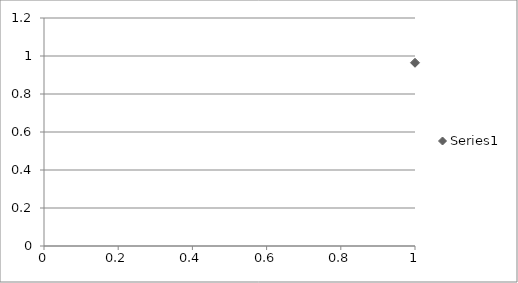
| Category | Series 0 |
|---|---|
| 0 | 0.964 |
| 1 | 0.108 |
| 2 | 0.126 |
| 3 | 0.35 |
| 4 | 0.215 |
| 5 | 0.462 |
| 6 | 0.497 |
| 7 | 0.971 |
| 8 | 0.632 |
| 9 | 0.214 |
| 10 | 0.374 |
| 11 | 0.754 |
| 12 | 0.197 |
| 13 | 0.841 |
| 14 | 0.139 |
| 15 | 0.509 |
| 16 | 0.901 |
| 17 | 0.523 |
| 18 | 0.504 |
| 19 | 0.668 |
| 20 | 0.908 |
| 21 | 0.339 |
| 22 | 0.966 |
| 23 | 0.082 |
| 24 | 0.018 |
| 25 | 0.483 |
| 26 | 0.585 |
| 27 | 0.712 |
| 28 | 0.056 |
| 29 | 0.386 |
| 30 | 0.513 |
| 31 | 0.481 |
| 32 | 0.746 |
| 33 | 0.662 |
| 34 | 0.565 |
| 35 | 0.668 |
| 36 | 0.032 |
| 37 | 0.702 |
| 38 | 0.179 |
| 39 | 0.099 |
| 40 | 0.786 |
| 41 | 0.452 |
| 42 | 0.988 |
| 43 | 0.299 |
| 44 | 0.237 |
| 45 | 0.693 |
| 46 | 0.95 |
| 47 | 0.008 |
| 48 | 0.587 |
| 49 | 0.468 |
| 50 | 0.325 |
| 51 | 0.137 |
| 52 | 0.388 |
| 53 | 0.441 |
| 54 | 0.627 |
| 55 | 0.654 |
| 56 | 0.939 |
| 57 | 0.945 |
| 58 | 0.495 |
| 59 | 0.209 |
| 60 | 0.556 |
| 61 | 0.982 |
| 62 | 0.539 |
| 63 | 0.829 |
| 64 | 0.675 |
| 65 | 0.525 |
| 66 | 0.032 |
| 67 | 0.222 |
| 68 | 0.001 |
| 69 | 0.052 |
| 70 | 0.384 |
| 71 | 0.608 |
| 72 | 0.71 |
| 73 | 0.337 |
| 74 | 0.727 |
| 75 | 0.946 |
| 76 | 0.787 |
| 77 | 0.031 |
| 78 | 0.849 |
| 79 | 0.59 |
| 80 | 0.38 |
| 81 | 0.543 |
| 82 | 0.306 |
| 83 | 0.293 |
| 84 | 0.263 |
| 85 | 0.341 |
| 86 | 0.958 |
| 87 | 0.161 |
| 88 | 0.018 |
| 89 | 0.322 |
| 90 | 0.839 |
| 91 | 0.08 |
| 92 | 0.7 |
| 93 | 0.92 |
| 94 | 0.735 |
| 95 | 0.815 |
| 96 | 0.788 |
| 97 | 0.943 |
| 98 | 0.381 |
| 99 | 0.764 |
| 100 | 0.171 |
| 101 | 0.246 |
| 102 | 0.247 |
| 103 | 0.099 |
| 104 | 0.295 |
| 105 | 0.354 |
| 106 | 0.834 |
| 107 | 0.998 |
| 108 | 0.956 |
| 109 | 0.673 |
| 110 | 0.473 |
| 111 | 0.728 |
| 112 | 0.249 |
| 113 | 0.071 |
| 114 | 0.127 |
| 115 | 0.199 |
| 116 | 0.549 |
| 117 | 0.355 |
| 118 | 0.424 |
| 119 | 0.923 |
| 120 | 0.4 |
| 121 | 0.304 |
| 122 | 0.174 |
| 123 | 0.596 |
| 124 | 0.894 |
| 125 | 0.275 |
| 126 | 0.883 |
| 127 | 0.578 |
| 128 | 0.822 |
| 129 | 0.9 |
| 130 | 0.183 |
| 131 | 0.86 |
| 132 | 0.188 |
| 133 | 0.451 |
| 134 | 0.958 |
| 135 | 0.277 |
| 136 | 0.422 |
| 137 | 0.264 |
| 138 | 0.416 |
| 139 | 0.442 |
| 140 | 0.82 |
| 141 | 0.099 |
| 142 | 0.677 |
| 143 | 0.889 |
| 144 | 0.832 |
| 145 | 0.068 |
| 146 | 0.707 |
| 147 | 0.9 |
| 148 | 0.861 |
| 149 | 0.378 |
| 150 | 0.135 |
| 151 | 0.01 |
| 152 | 0.655 |
| 153 | 0.379 |
| 154 | 0.309 |
| 155 | 0.417 |
| 156 | 0.222 |
| 157 | 0.639 |
| 158 | 0.36 |
| 159 | 0.918 |
| 160 | 0.589 |
| 161 | 0.856 |
| 162 | 0.449 |
| 163 | 0.572 |
| 164 | 0.22 |
| 165 | 0.833 |
| 166 | 0.286 |
| 167 | 0.704 |
| 168 | 0.881 |
| 169 | 0.288 |
| 170 | 0.693 |
| 171 | 0.069 |
| 172 | 0.238 |
| 173 | 0.693 |
| 174 | 0.838 |
| 175 | 0.29 |
| 176 | 0.423 |
| 177 | 0.927 |
| 178 | 0.977 |
| 179 | 0.618 |
| 180 | 0.931 |
| 181 | 0.859 |
| 182 | 0.653 |
| 183 | 0.353 |
| 184 | 0.578 |
| 185 | 0.79 |
| 186 | 0.38 |
| 187 | 0.473 |
| 188 | 0.525 |
| 189 | 0.731 |
| 190 | 0.204 |
| 191 | 0.638 |
| 192 | 0.318 |
| 193 | 0.777 |
| 194 | 0.235 |
| 195 | 0.755 |
| 196 | 0.326 |
| 197 | 0.416 |
| 198 | 0.091 |
| 199 | 0.897 |
| 200 | 0.491 |
| 201 | 0.196 |
| 202 | 0.493 |
| 203 | 0.071 |
| 204 | 0.766 |
| 205 | 0.931 |
| 206 | 0.158 |
| 207 | 0.71 |
| 208 | 0.509 |
| 209 | 0.424 |
| 210 | 0.221 |
| 211 | 0.516 |
| 212 | 0.542 |
| 213 | 0.944 |
| 214 | 0.137 |
| 215 | 0.964 |
| 216 | 0.585 |
| 217 | 0.384 |
| 218 | 0.198 |
| 219 | 0.447 |
| 220 | 0.789 |
| 221 | 0.864 |
| 222 | 0.142 |
| 223 | 0.188 |
| 224 | 0.358 |
| 225 | 0.207 |
| 226 | 0.124 |
| 227 | 0.571 |
| 228 | 0.538 |
| 229 | 0.928 |
| 230 | 0.747 |
| 231 | 0.669 |
| 232 | 0.53 |
| 233 | 0.06 |
| 234 | 0.235 |
| 235 | 0.617 |
| 236 | 0.808 |
| 237 | 0.393 |
| 238 | 0.296 |
| 239 | 0.854 |
| 240 | 0.611 |
| 241 | 0.027 |
| 242 | 0.132 |
| 243 | 0.101 |
| 244 | 0.156 |
| 245 | 0.203 |
| 246 | 0.772 |
| 247 | 0.312 |
| 248 | 0.908 |
| 249 | 0.479 |
| 250 | 0.969 |
| 251 | 0.513 |
| 252 | 0.789 |
| 253 | 0.669 |
| 254 | 0.72 |
| 255 | 0.734 |
| 256 | 0.635 |
| 257 | 0.592 |
| 258 | 0.559 |
| 259 | 0.118 |
| 260 | 0.391 |
| 261 | 0.925 |
| 262 | 0.631 |
| 263 | 0.116 |
| 264 | 0.899 |
| 265 | 0.778 |
| 266 | 0.705 |
| 267 | 0.021 |
| 268 | 0.129 |
| 269 | 0.419 |
| 270 | 0.078 |
| 271 | 0.962 |
| 272 | 0.52 |
| 273 | 0.427 |
| 274 | 0.562 |
| 275 | 0.83 |
| 276 | 0.15 |
| 277 | 0.986 |
| 278 | 0.834 |
| 279 | 0.577 |
| 280 | 0.838 |
| 281 | 0.952 |
| 282 | 0.195 |
| 283 | 0.678 |
| 284 | 0.069 |
| 285 | 0.437 |
| 286 | 0.51 |
| 287 | 0.619 |
| 288 | 0.355 |
| 289 | 0.609 |
| 290 | 0.803 |
| 291 | 0.848 |
| 292 | 0.223 |
| 293 | 0.09 |
| 294 | 0.792 |
| 295 | 0.14 |
| 296 | 0.827 |
| 297 | 0.739 |
| 298 | 0.945 |
| 299 | 0.255 |
| 300 | 0.177 |
| 301 | 0.805 |
| 302 | 0.149 |
| 303 | 0.217 |
| 304 | 0.996 |
| 305 | 0.294 |
| 306 | 0.937 |
| 307 | 0.143 |
| 308 | 0.079 |
| 309 | 0.51 |
| 310 | 0.998 |
| 311 | 0.346 |
| 312 | 0.151 |
| 313 | 0.264 |
| 314 | 0.705 |
| 315 | 0.948 |
| 316 | 0.612 |
| 317 | 0.174 |
| 318 | 0.706 |
| 319 | 0.508 |
| 320 | 0.683 |
| 321 | 0.378 |
| 322 | 0.136 |
| 323 | 0.746 |
| 324 | 0.302 |
| 325 | 0.001 |
| 326 | 0.28 |
| 327 | 0.511 |
| 328 | 0.257 |
| 329 | 0.935 |
| 330 | 0.316 |
| 331 | 0.546 |
| 332 | 0.54 |
| 333 | 0.772 |
| 334 | 0.903 |
| 335 | 0.274 |
| 336 | 0.133 |
| 337 | 0.33 |
| 338 | 0.805 |
| 339 | 0.252 |
| 340 | 0.896 |
| 341 | 0.592 |
| 342 | 0.953 |
| 343 | 0.169 |
| 344 | 0.16 |
| 345 | 0.943 |
| 346 | 0.975 |
| 347 | 0.007 |
| 348 | 0.137 |
| 349 | 0.097 |
| 350 | 0.997 |
| 351 | 0.064 |
| 352 | 0.503 |
| 353 | 0.753 |
| 354 | 0.468 |
| 355 | 0.139 |
| 356 | 0.368 |
| 357 | 0.758 |
| 358 | 0.322 |
| 359 | 0.009 |
| 360 | 0.069 |
| 361 | 0.073 |
| 362 | 0.434 |
| 363 | 0.27 |
| 364 | 0.479 |
| 365 | 0.123 |
| 366 | 0.759 |
| 367 | 0.908 |
| 368 | 0.957 |
| 369 | 0.966 |
| 370 | 0.25 |
| 371 | 0.694 |
| 372 | 0.19 |
| 373 | 0.069 |
| 374 | 0.523 |
| 375 | 0.099 |
| 376 | 0.088 |
| 377 | 0.803 |
| 378 | 0.156 |
| 379 | 0.287 |
| 380 | 0.023 |
| 381 | 0.539 |
| 382 | 0.343 |
| 383 | 0.031 |
| 384 | 0.327 |
| 385 | 0.721 |
| 386 | 0.229 |
| 387 | 0.802 |
| 388 | 0.263 |
| 389 | 0.633 |
| 390 | 0.975 |
| 391 | 0.433 |
| 392 | 0.56 |
| 393 | 0.476 |
| 394 | 0.291 |
| 395 | 0.664 |
| 396 | 0.18 |
| 397 | 0.074 |
| 398 | 0.228 |
| 399 | 0.232 |
| 400 | 0.961 |
| 401 | 0.874 |
| 402 | 0.842 |
| 403 | 0.67 |
| 404 | 0.082 |
| 405 | 0.504 |
| 406 | 0.884 |
| 407 | 0.982 |
| 408 | 0.898 |
| 409 | 0.27 |
| 410 | 0.176 |
| 411 | 0.032 |
| 412 | 0.826 |
| 413 | 0.868 |
| 414 | 0.684 |
| 415 | 0.997 |
| 416 | 0.25 |
| 417 | 0.098 |
| 418 | 0.134 |
| 419 | 0.274 |
| 420 | 0.742 |
| 421 | 0.318 |
| 422 | 0.148 |
| 423 | 0.145 |
| 424 | 0.17 |
| 425 | 0.761 |
| 426 | 0.429 |
| 427 | 0.775 |
| 428 | 0.807 |
| 429 | 0.719 |
| 430 | 0.208 |
| 431 | 0.013 |
| 432 | 0.638 |
| 433 | 0.777 |
| 434 | 0.497 |
| 435 | 0.93 |
| 436 | 0.095 |
| 437 | 0.908 |
| 438 | 0.046 |
| 439 | 0.608 |
| 440 | 0.49 |
| 441 | 0.945 |
| 442 | 0.288 |
| 443 | 0.67 |
| 444 | 0.196 |
| 445 | 0.67 |
| 446 | 0.149 |
| 447 | 0.712 |
| 448 | 0.869 |
| 449 | 0.462 |
| 450 | 0.667 |
| 451 | 0.717 |
| 452 | 0.698 |
| 453 | 0.735 |
| 454 | 0.452 |
| 455 | 0.47 |
| 456 | 0.645 |
| 457 | 0.719 |
| 458 | 0.643 |
| 459 | 0.142 |
| 460 | 0.333 |
| 461 | 0.94 |
| 462 | 0.834 |
| 463 | 0.037 |
| 464 | 0.533 |
| 465 | 0.255 |
| 466 | 0.657 |
| 467 | 0.657 |
| 468 | 0.145 |
| 469 | 0.063 |
| 470 | 0.638 |
| 471 | 0.014 |
| 472 | 0.81 |
| 473 | 0.292 |
| 474 | 0.981 |
| 475 | 0.446 |
| 476 | 0.362 |
| 477 | 0.365 |
| 478 | 0.016 |
| 479 | 0.644 |
| 480 | 0.488 |
| 481 | 0.633 |
| 482 | 0.684 |
| 483 | 0.26 |
| 484 | 0.393 |
| 485 | 0.617 |
| 486 | 0.62 |
| 487 | 0.68 |
| 488 | 0.756 |
| 489 | 0.75 |
| 490 | 0.751 |
| 491 | 0.112 |
| 492 | 0.406 |
| 493 | 0.329 |
| 494 | 0.692 |
| 495 | 0.961 |
| 496 | 0.295 |
| 497 | 0.873 |
| 498 | 0.569 |
| 499 | 0.717 |
| 500 | 0.634 |
| 501 | 0.651 |
| 502 | 0.629 |
| 503 | 0.044 |
| 504 | 0.094 |
| 505 | 0.325 |
| 506 | 0.456 |
| 507 | 0.761 |
| 508 | 0.535 |
| 509 | 0.869 |
| 510 | 0.597 |
| 511 | 0.179 |
| 512 | 0.327 |
| 513 | 0.462 |
| 514 | 0.674 |
| 515 | 0.108 |
| 516 | 0.303 |
| 517 | 0.549 |
| 518 | 0.377 |
| 519 | 0.062 |
| 520 | 0.569 |
| 521 | 0.917 |
| 522 | 0.287 |
| 523 | 0.549 |
| 524 | 0.749 |
| 525 | 0.321 |
| 526 | 0.264 |
| 527 | 0.616 |
| 528 | 0.223 |
| 529 | 0.747 |
| 530 | 0.626 |
| 531 | 0.034 |
| 532 | 0.677 |
| 533 | 0.995 |
| 534 | 0.091 |
| 535 | 0.989 |
| 536 | 0.425 |
| 537 | 0.019 |
| 538 | 0.695 |
| 539 | 0.819 |
| 540 | 0.685 |
| 541 | 0.6 |
| 542 | 0.042 |
| 543 | 0.323 |
| 544 | 0.715 |
| 545 | 0.305 |
| 546 | 0.378 |
| 547 | 0.44 |
| 548 | 0.977 |
| 549 | 0.262 |
| 550 | 0.524 |
| 551 | 0.612 |
| 552 | 0.597 |
| 553 | 0.084 |
| 554 | 0.344 |
| 555 | 0.65 |
| 556 | 0.943 |
| 557 | 0.572 |
| 558 | 0.74 |
| 559 | 0.05 |
| 560 | 0.522 |
| 561 | 0.703 |
| 562 | 0.044 |
| 563 | 0.996 |
| 564 | 0.059 |
| 565 | 0.175 |
| 566 | 0.315 |
| 567 | 0.478 |
| 568 | 0.926 |
| 569 | 0.679 |
| 570 | 0.517 |
| 571 | 0.166 |
| 572 | 0.561 |
| 573 | 0.141 |
| 574 | 0.512 |
| 575 | 0.63 |
| 576 | 0.1 |
| 577 | 0.003 |
| 578 | 0.472 |
| 579 | 0.648 |
| 580 | 0.433 |
| 581 | 0.177 |
| 582 | 0.398 |
| 583 | 0.425 |
| 584 | 0.039 |
| 585 | 0.395 |
| 586 | 0.371 |
| 587 | 0.426 |
| 588 | 0.341 |
| 589 | 0.55 |
| 590 | 0.372 |
| 591 | 0.748 |
| 592 | 0.378 |
| 593 | 0.736 |
| 594 | 0.815 |
| 595 | 0.882 |
| 596 | 0.847 |
| 597 | 0.642 |
| 598 | 0.01 |
| 599 | 0.999 |
| 600 | 0.054 |
| 601 | 0.444 |
| 602 | 0.536 |
| 603 | 0.543 |
| 604 | 0.639 |
| 605 | 0.215 |
| 606 | 0 |
| 607 | 0.181 |
| 608 | 0.832 |
| 609 | 0.92 |
| 610 | 0.916 |
| 611 | 0.663 |
| 612 | 0.23 |
| 613 | 0.644 |
| 614 | 0.649 |
| 615 | 0.812 |
| 616 | 0.232 |
| 617 | 0.265 |
| 618 | 0.466 |
| 619 | 0.894 |
| 620 | 0.263 |
| 621 | 0.312 |
| 622 | 0.058 |
| 623 | 0.269 |
| 624 | 0.098 |
| 625 | 0.702 |
| 626 | 0.251 |
| 627 | 0.351 |
| 628 | 0.401 |
| 629 | 0.507 |
| 630 | 0.767 |
| 631 | 0.139 |
| 632 | 0.826 |
| 633 | 0.578 |
| 634 | 0.737 |
| 635 | 0.182 |
| 636 | 0.061 |
| 637 | 0.248 |
| 638 | 0.43 |
| 639 | 0.763 |
| 640 | 0.741 |
| 641 | 0.864 |
| 642 | 0.477 |
| 643 | 0.923 |
| 644 | 0.673 |
| 645 | 0.339 |
| 646 | 0.066 |
| 647 | 0.914 |
| 648 | 0.548 |
| 649 | 0.961 |
| 650 | 0.08 |
| 651 | 0.629 |
| 652 | 0.002 |
| 653 | 0.371 |
| 654 | 0.532 |
| 655 | 0.302 |
| 656 | 0.998 |
| 657 | 0.866 |
| 658 | 0.214 |
| 659 | 0.437 |
| 660 | 0.147 |
| 661 | 0.693 |
| 662 | 0.492 |
| 663 | 0.591 |
| 664 | 0.203 |
| 665 | 0.486 |
| 666 | 0.52 |
| 667 | 0.144 |
| 668 | 0.19 |
| 669 | 0.125 |
| 670 | 0.772 |
| 671 | 0.334 |
| 672 | 0.955 |
| 673 | 0.047 |
| 674 | 0.053 |
| 675 | 0.295 |
| 676 | 0.717 |
| 677 | 0.515 |
| 678 | 0.43 |
| 679 | 0.535 |
| 680 | 0.433 |
| 681 | 0.407 |
| 682 | 0.133 |
| 683 | 0.055 |
| 684 | 0.61 |
| 685 | 0.963 |
| 686 | 0.781 |
| 687 | 0.53 |
| 688 | 0.278 |
| 689 | 0.179 |
| 690 | 0.769 |
| 691 | 0.395 |
| 692 | 0.932 |
| 693 | 0.219 |
| 694 | 0.65 |
| 695 | 0.299 |
| 696 | 0.035 |
| 697 | 0.556 |
| 698 | 0.392 |
| 699 | 0.597 |
| 700 | 0.857 |
| 701 | 0.919 |
| 702 | 0.012 |
| 703 | 0.964 |
| 704 | 0.138 |
| 705 | 0.689 |
| 706 | 0.487 |
| 707 | 0.265 |
| 708 | 0.824 |
| 709 | 0.32 |
| 710 | 0.243 |
| 711 | 0.037 |
| 712 | 0.363 |
| 713 | 0.459 |
| 714 | 0.866 |
| 715 | 0.242 |
| 716 | 0.825 |
| 717 | 0.296 |
| 718 | 0.198 |
| 719 | 0.892 |
| 720 | 0.78 |
| 721 | 0.885 |
| 722 | 0.381 |
| 723 | 0.508 |
| 724 | 0.177 |
| 725 | 0.159 |
| 726 | 0.923 |
| 727 | 0.932 |
| 728 | 0.071 |
| 729 | 0.453 |
| 730 | 0.291 |
| 731 | 0.813 |
| 732 | 0.569 |
| 733 | 0.776 |
| 734 | 0.652 |
| 735 | 0.992 |
| 736 | 0.2 |
| 737 | 0.406 |
| 738 | 0.648 |
| 739 | 0.806 |
| 740 | 0.288 |
| 741 | 0.594 |
| 742 | 0.661 |
| 743 | 0.37 |
| 744 | 0.83 |
| 745 | 0.707 |
| 746 | 0.388 |
| 747 | 0.488 |
| 748 | 0.551 |
| 749 | 0.145 |
| 750 | 0.781 |
| 751 | 0.868 |
| 752 | 0.559 |
| 753 | 0.145 |
| 754 | 0.371 |
| 755 | 0.418 |
| 756 | 0.666 |
| 757 | 0.886 |
| 758 | 0.036 |
| 759 | 0.1 |
| 760 | 0.606 |
| 761 | 0.345 |
| 762 | 0.816 |
| 763 | 0.15 |
| 764 | 0.4 |
| 765 | 0.984 |
| 766 | 0.532 |
| 767 | 0.731 |
| 768 | 0.146 |
| 769 | 0.207 |
| 770 | 0.098 |
| 771 | 0.535 |
| 772 | 0.994 |
| 773 | 0.852 |
| 774 | 0.622 |
| 775 | 0.233 |
| 776 | 0.694 |
| 777 | 0.882 |
| 778 | 0.879 |
| 779 | 0.605 |
| 780 | 0.181 |
| 781 | 0.524 |
| 782 | 0.56 |
| 783 | 0.955 |
| 784 | 0.97 |
| 785 | 0.45 |
| 786 | 0.53 |
| 787 | 0.156 |
| 788 | 0.066 |
| 789 | 0.735 |
| 790 | 0.511 |
| 791 | 0.361 |
| 792 | 0.084 |
| 793 | 0.027 |
| 794 | 0.106 |
| 795 | 0.865 |
| 796 | 0.396 |
| 797 | 0.473 |
| 798 | 0.678 |
| 799 | 0.292 |
| 800 | 0.021 |
| 801 | 0.133 |
| 802 | 0.087 |
| 803 | 0.255 |
| 804 | 0.378 |
| 805 | 0.065 |
| 806 | 0.889 |
| 807 | 0.751 |
| 808 | 0.383 |
| 809 | 0.208 |
| 810 | 0.059 |
| 811 | 0.143 |
| 812 | 0.662 |
| 813 | 0.092 |
| 814 | 0.271 |
| 815 | 0.303 |
| 816 | 0.401 |
| 817 | 0.819 |
| 818 | 0.483 |
| 819 | 0.884 |
| 820 | 0.716 |
| 821 | 0.308 |
| 822 | 0.697 |
| 823 | 0.252 |
| 824 | 0.453 |
| 825 | 0.867 |
| 826 | 0.094 |
| 827 | 0.48 |
| 828 | 0.545 |
| 829 | 0.076 |
| 830 | 0.401 |
| 831 | 0.127 |
| 832 | 0.916 |
| 833 | 0.658 |
| 834 | 0.896 |
| 835 | 0.291 |
| 836 | 0.8 |
| 837 | 0.621 |
| 838 | 0.855 |
| 839 | 0.701 |
| 840 | 0.751 |
| 841 | 0.434 |
| 842 | 0.31 |
| 843 | 0.831 |
| 844 | 0.513 |
| 845 | 0.194 |
| 846 | 0.357 |
| 847 | 0.903 |
| 848 | 0.988 |
| 849 | 0.314 |
| 850 | 0.633 |
| 851 | 0.556 |
| 852 | 0.732 |
| 853 | 0.531 |
| 854 | 0.85 |
| 855 | 0.837 |
| 856 | 0.534 |
| 857 | 0.506 |
| 858 | 0.016 |
| 859 | 0.628 |
| 860 | 0.221 |
| 861 | 0.388 |
| 862 | 0.931 |
| 863 | 0.823 |
| 864 | 0.21 |
| 865 | 0.166 |
| 866 | 0.44 |
| 867 | 0.643 |
| 868 | 0.2 |
| 869 | 0.178 |
| 870 | 0.942 |
| 871 | 0.495 |
| 872 | 0.275 |
| 873 | 0.52 |
| 874 | 0.372 |
| 875 | 0.275 |
| 876 | 0.161 |
| 877 | 0.44 |
| 878 | 0.844 |
| 879 | 0.783 |
| 880 | 0.345 |
| 881 | 0.24 |
| 882 | 0.912 |
| 883 | 0.558 |
| 884 | 0.197 |
| 885 | 0.002 |
| 886 | 0.723 |
| 887 | 0.708 |
| 888 | 0.551 |
| 889 | 0.309 |
| 890 | 0.095 |
| 891 | 0.061 |
| 892 | 0.992 |
| 893 | 0.128 |
| 894 | 0.154 |
| 895 | 0.623 |
| 896 | 0.806 |
| 897 | 0.234 |
| 898 | 0.125 |
| 899 | 0.88 |
| 900 | 0.26 |
| 901 | 0.694 |
| 902 | 0.722 |
| 903 | 0.107 |
| 904 | 0.606 |
| 905 | 0.052 |
| 906 | 0.74 |
| 907 | 0.875 |
| 908 | 0.538 |
| 909 | 0.14 |
| 910 | 0.657 |
| 911 | 0.361 |
| 912 | 0.909 |
| 913 | 0.253 |
| 914 | 0.437 |
| 915 | 0.74 |
| 916 | 0.766 |
| 917 | 0.098 |
| 918 | 0.204 |
| 919 | 0.479 |
| 920 | 0.854 |
| 921 | 0.649 |
| 922 | 0 |
| 923 | 0.934 |
| 924 | 0.995 |
| 925 | 0.726 |
| 926 | 0.445 |
| 927 | 0.728 |
| 928 | 0.044 |
| 929 | 0.654 |
| 930 | 0.787 |
| 931 | 0.604 |
| 932 | 0.702 |
| 933 | 0.692 |
| 934 | 0.073 |
| 935 | 0.251 |
| 936 | 0.866 |
| 937 | 0.205 |
| 938 | 0.687 |
| 939 | 0.494 |
| 940 | 0.066 |
| 941 | 0.449 |
| 942 | 0.14 |
| 943 | 0.989 |
| 944 | 0.833 |
| 945 | 0.346 |
| 946 | 0.427 |
| 947 | 0.56 |
| 948 | 0.749 |
| 949 | 0.561 |
| 950 | 0.422 |
| 951 | 0.248 |
| 952 | 0.667 |
| 953 | 0.646 |
| 954 | 0.335 |
| 955 | 0.082 |
| 956 | 0.357 |
| 957 | 0.686 |
| 958 | 0.392 |
| 959 | 0.623 |
| 960 | 0.147 |
| 961 | 0.99 |
| 962 | 0.504 |
| 963 | 0.36 |
| 964 | 0.716 |
| 965 | 0.927 |
| 966 | 0.815 |
| 967 | 0.432 |
| 968 | 0.593 |
| 969 | 0.716 |
| 970 | 0.674 |
| 971 | 0.329 |
| 972 | 0.545 |
| 973 | 0.553 |
| 974 | 0.096 |
| 975 | 0.945 |
| 976 | 0.781 |
| 977 | 0.64 |
| 978 | 0.701 |
| 979 | 0.494 |
| 980 | 0.29 |
| 981 | 0.231 |
| 982 | 0.172 |
| 983 | 0.222 |
| 984 | 0.402 |
| 985 | 0.874 |
| 986 | 0.495 |
| 987 | 0.606 |
| 988 | 0.594 |
| 989 | 0.46 |
| 990 | 0.569 |
| 991 | 0.014 |
| 992 | 0.019 |
| 993 | 0.028 |
| 994 | 0.894 |
| 995 | 0.18 |
| 996 | 0.666 |
| 997 | 0.811 |
| 998 | 0.897 |
| 999 | 0.393 |
| 1000 | 0.34 |